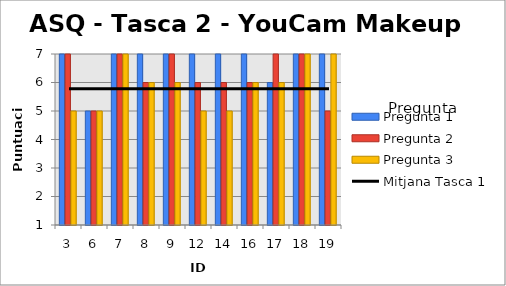
| Category | Pregunta 1 | Pregunta 2 | Pregunta 3 |
|---|---|---|---|
| 3.0 | 7 | 7 | 5 |
| 6.0 | 5 | 5 | 5 |
| 7.0 | 7 | 7 | 7 |
| 8.0 | 7 | 6 | 6 |
| 9.0 | 7 | 7 | 6 |
| 12.0 | 7 | 6 | 5 |
| 14.0 | 7 | 6 | 5 |
| 16.0 | 7 | 6 | 6 |
| 17.0 | 6 | 7 | 6 |
| 18.0 | 7 | 7 | 7 |
| 19.0 | 7 | 5 | 7 |